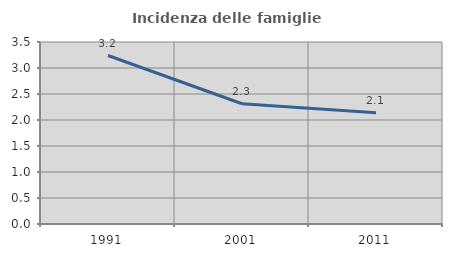
| Category | Incidenza delle famiglie numerose |
|---|---|
| 1991.0 | 3.24 |
| 2001.0 | 2.313 |
| 2011.0 | 2.141 |